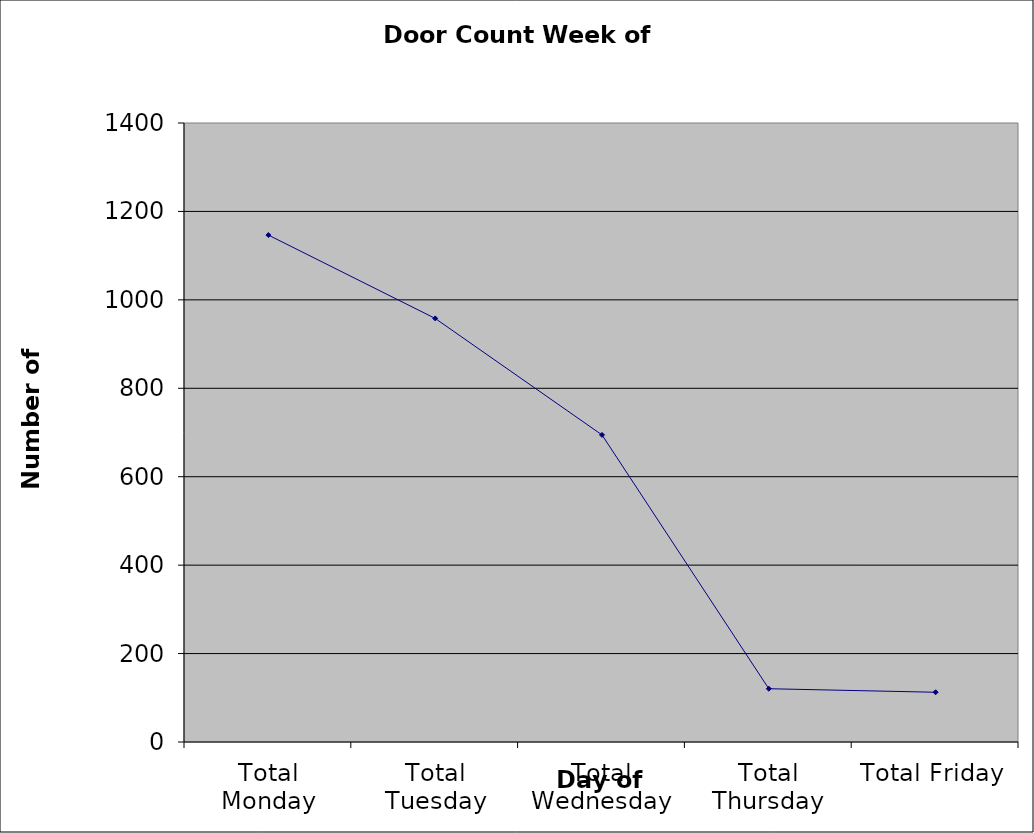
| Category | Series 0 |
|---|---|
| Total Monday | 1146.5 |
| Total Tuesday | 958 |
| Total Wednesday | 694.5 |
| Total Thursday | 120.5 |
| Total Friday | 112.5 |